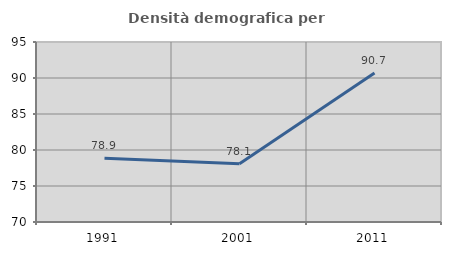
| Category | Densità demografica |
|---|---|
| 1991.0 | 78.855 |
| 2001.0 | 78.105 |
| 2011.0 | 90.698 |